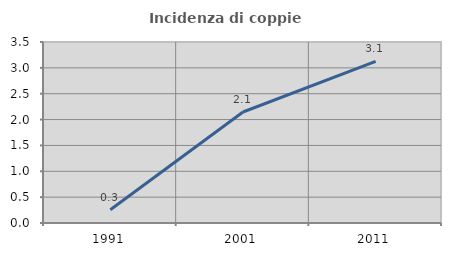
| Category | Incidenza di coppie miste |
|---|---|
| 1991.0 | 0.258 |
| 2001.0 | 2.146 |
| 2011.0 | 3.125 |